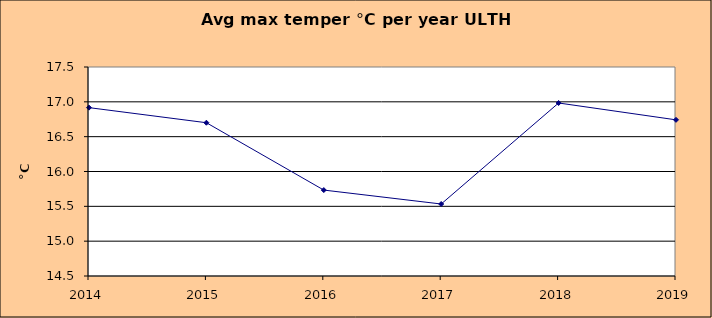
| Category | Series 0 |
|---|---|
| 2014.0 | 16.917 |
| 2015.0 | 16.7 |
| 2016.0 | 15.733 |
| 2017.0 | 15.533 |
| 2018.0 | 16.983 |
| 2019.0 | 16.742 |